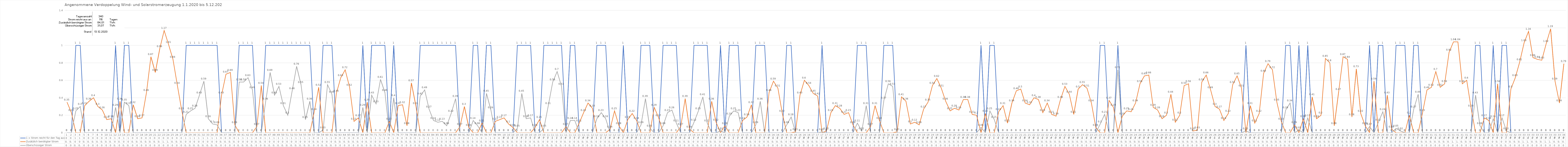
| Category | 1 = Strom reicht für den Tag aus | Zusätzlich benötigter Strom | Überschüssiger Strom |
|---|---|---|---|
| 0 | 0 | 0.35 | 0 |
| 1 | 0 | 0.23 | 0 |
| 2 | 1 | 0 | 0.25 |
| 3 | 1 | 0 | 0.3 |
| 4 | 0 | 0.31 | 0 |
| 5 | 0 | 0.36 | 0 |
| 6 | 0 | 0.4 | 0 |
| 7 | 0 | 0.3 | 0 |
| 8 | 0 | 0.26 | 0 |
| 9 | 0 | 0.15 | 0 |
| 10 | 0 | 0.16 | 0 |
| 11 | 1 | 0 | 0.29 |
| 12 | 0 | 0.36 | 0 |
| 13 | 1 | 0 | 0.35 |
| 14 | 1 | 0 | 0.31 |
| 15 | 0 | 0.32 | 0 |
| 16 | 0 | 0.16 | 0 |
| 17 | 0 | 0.17 | 0 |
| 18 | 0 | 0.46 | 0 |
| 19 | 0 | 0.87 | 0 |
| 20 | 0 | 0.69 | 0 |
| 21 | 0 | 0.96 | 0 |
| 22 | 0 | 1.17 | 0 |
| 23 | 0 | 1.01 | 0 |
| 24 | 0 | 0.84 | 0 |
| 25 | 0 | 0.54 | 0 |
| 26 | 0 | 0.25 | 0 |
| 27 | 1 | 0 | 0.21 |
| 28 | 1 | 0 | 0.25 |
| 29 | 1 | 0 | 0.28 |
| 30 | 1 | 0 | 0.43 |
| 31 | 1 | 0 | 0.59 |
| 32 | 1 | 0 | 0.16 |
| 33 | 1 | 0 | 0.1 |
| 34 | 1 | 0 | 0.09 |
| 35 | 0 | 0.43 | 0 |
| 36 | 0 | 0.67 | 0 |
| 37 | 0 | 0.69 | 0 |
| 38 | 0 | 0.09 | 0 |
| 39 | 1 | 0 | 0.58 |
| 40 | 1 | 0 | 0.58 |
| 41 | 1 | 0 | 0.63 |
| 42 | 1 | 0 | 0.49 |
| 43 | 0 | 0.07 | 0 |
| 44 | 0 | 0.54 | 0 |
| 45 | 1 | 0 | 0.36 |
| 46 | 1 | 0 | 0.69 |
| 47 | 1 | 0 | 0.43 |
| 48 | 1 | 0 | 0.53 |
| 49 | 1 | 0 | 0.31 |
| 50 | 1 | 0 | 0.2 |
| 51 | 1 | 0 | 0.48 |
| 52 | 1 | 0 | 0.76 |
| 53 | 1 | 0 | 0.55 |
| 54 | 1 | 0 | 0.15 |
| 55 | 1 | 0 | 0.36 |
| 56 | 0 | 0.24 | 0 |
| 57 | 0 | 0.52 | 0 |
| 58 | 1 | 0 | 0.03 |
| 59 | 1 | 0 | 0.55 |
| 60 | 1 | 0 | 0.44 |
| 61 | 0 | 0.45 | 0 |
| 62 | 0 | 0.63 | 0 |
| 63 | 0 | 0.72 | 0 |
| 64 | 0 | 0.52 | 0 |
| 65 | 0 | 0.13 | 0 |
| 66 | 0 | 0.17 | 0 |
| 67 | 1 | 0 | 0.29 |
| 68 | 0 | 0.35 | 0 |
| 69 | 1 | 0 | 0.43 |
| 70 | 1 | 0 | 0.33 |
| 71 | 1 | 0 | 0.61 |
| 72 | 1 | 0 | 0.46 |
| 73 | 0 | 0.13 | 0 |
| 74 | 1 | 0 | 0.4 |
| 75 | 0 | 0.31 | 0 |
| 76 | 0 | 0.32 | 0 |
| 77 | 0 | 0.08 | 0 |
| 78 | 0 | 0.57 | 0 |
| 79 | 0 | 0.31 | 0 |
| 80 | 1 | 0 | 0.42 |
| 81 | 1 | 0 | 0.49 |
| 82 | 1 | 0 | 0.27 |
| 83 | 1 | 0 | 0.14 |
| 84 | 1 | 0 | 0.12 |
| 85 | 1 | 0 | 0.13 |
| 86 | 1 | 0 | 0.08 |
| 87 | 1 | 0 | 0.22 |
| 88 | 1 | 0 | 0.39 |
| 89 | 0 | 0.07 | 0 |
| 90 | 0 | 0.3 | 0 |
| 91 | 0 | 0.06 | 0 |
| 92 | 1 | 0 | 0.14 |
| 93 | 1 | 0 | 0.08 |
| 94 | 0 | 0.11 | 0 |
| 95 | 1 | 0 | 0.45 |
| 96 | 1 | 0 | 0.26 |
| 97 | 0 | 0.13 | 0 |
| 98 | 0 | 0.15 | 0 |
| 99 | 0 | 0.17 | 0 |
| 100 | 0 | 0.1 | 0 |
| 101 | 0 | 0.06 | 0 |
| 102 | 1 | 0 | 0.05 |
| 103 | 1 | 0 | 0.45 |
| 104 | 1 | 0 | 0.16 |
| 105 | 1 | 0 | 0.17 |
| 106 | 0 | 0.06 | 0 |
| 107 | 0 | 0.15 | 0 |
| 108 | 1 | 0 | 0.05 |
| 109 | 1 | 0 | 0.31 |
| 110 | 1 | 0 | 0.58 |
| 111 | 1 | 0 | 0.7 |
| 112 | 1 | 0 | 0.53 |
| 113 | 0 | 0.07 | 0 |
| 114 | 1 | 0 | 0.14 |
| 115 | 1 | 0 | 0.14 |
| 116 | 0 | 0.11 | 0 |
| 117 | 0 | 0.23 | 0 |
| 118 | 0 | 0.34 | 0 |
| 119 | 0 | 0.28 | 0 |
| 120 | 1 | 0 | 0.16 |
| 121 | 1 | 0 | 0.23 |
| 122 | 1 | 0 | 0.16 |
| 123 | 0 | 0.04 | 0 |
| 124 | 0 | 0.25 | 0 |
| 125 | 0 | 0.08 | 0 |
| 126 | 1 | 0 | 0 |
| 127 | 0 | 0.15 | 0 |
| 128 | 0 | 0.22 | 0 |
| 129 | 0 | 0.14 | 0 |
| 130 | 1 | 0 | 0.09 |
| 131 | 1 | 0 | 0.39 |
| 132 | 1 | 0 | 0.05 |
| 133 | 0 | 0.29 | 0 |
| 134 | 0 | 0.17 | 0 |
| 135 | 1 | 0 | 0.08 |
| 136 | 1 | 0 | 0.23 |
| 137 | 1 | 0 | 0.26 |
| 138 | 1 | 0 | 0.11 |
| 139 | 0 | 0.07 | 0 |
| 140 | 0 | 0.39 | 0 |
| 141 | 0 | 0.04 | 0 |
| 142 | 1 | 0 | 0.12 |
| 143 | 1 | 0 | 0.25 |
| 144 | 1 | 0 | 0.41 |
| 145 | 1 | 0 | 0.11 |
| 146 | 0 | 0.36 | 0 |
| 147 | 0 | 0.12 | 0 |
| 148 | 1 | 0 | 0.02 |
| 149 | 0 | 0.08 | 0 |
| 150 | 1 | 0 | 0.19 |
| 151 | 1 | 0 | 0.25 |
| 152 | 1 | 0 | 0.23 |
| 153 | 0 | 0.14 | 0 |
| 154 | 0 | 0.18 | 0 |
| 155 | 0 | 0.32 | 0 |
| 156 | 1 | 0 | 0.09 |
| 157 | 1 | 0 | 0.36 |
| 158 | 1 | 0 | 0 |
| 159 | 0 | 0.46 | 0 |
| 160 | 0 | 0.59 | 0 |
| 161 | 0 | 0.51 | 0 |
| 162 | 0 | 0.22 | 0 |
| 163 | 1 | 0 | 0.09 |
| 164 | 1 | 0 | 0.18 |
| 165 | 0 | 0.01 | 0 |
| 166 | 0 | 0.43 | 0 |
| 167 | 0 | 0.6 | 0 |
| 168 | 0 | 0.54 | 0 |
| 169 | 0 | 0.45 | 0 |
| 170 | 0 | 0.42 | 0 |
| 171 | 1 | 0 | 0.01 |
| 172 | 0 | 0.02 | 0 |
| 173 | 0 | 0.23 | 0 |
| 174 | 0 | 0.31 | 0 |
| 175 | 0 | 0.28 | 0 |
| 176 | 0 | 0.21 | 0 |
| 177 | 0 | 0.23 | 0 |
| 178 | 0 | 0.09 | 0 |
| 179 | 1 | 0 | 0.11 |
| 180 | 1 | 0 | 0.02 |
| 181 | 1 | 0 | 0.31 |
| 182 | 0 | 0.07 | 0 |
| 183 | 0 | 0.31 | 0 |
| 184 | 0 | 0.14 | 0 |
| 185 | 1 | 0 | 0.37 |
| 186 | 1 | 0 | 0.56 |
| 187 | 1 | 0 | 0.53 |
| 188 | 0 | 0.01 | 0 |
| 189 | 0 | 0.41 | 0 |
| 190 | 0 | 0.36 | 0 |
| 191 | 0 | 0.1 | 0 |
| 192 | 0 | 0.12 | 0 |
| 193 | 0 | 0.09 | 0 |
| 194 | 0 | 0.27 | 0 |
| 195 | 0 | 0.35 | 0 |
| 196 | 0 | 0.54 | 0 |
| 197 | 0 | 0.62 | 0 |
| 198 | 0 | 0.51 | 0 |
| 199 | 0 | 0.36 | 0 |
| 200 | 0 | 0.25 | 0 |
| 201 | 0 | 0.28 | 0 |
| 202 | 0 | 0.26 | 0 |
| 203 | 0 | 0.38 | 0 |
| 204 | 0 | 0.38 | 0 |
| 205 | 0 | 0.21 | 0 |
| 206 | 0 | 0.2 | 0 |
| 207 | 1 | 0 | 0.06 |
| 208 | 0 | 0.22 | 0 |
| 209 | 1 | 0 | 0.25 |
| 210 | 1 | 0 | 0.15 |
| 211 | 0 | 0.24 | 0 |
| 212 | 0 | 0.31 | 0 |
| 213 | 0 | 0.11 | 0 |
| 214 | 0 | 0.34 | 0 |
| 215 | 0 | 0.48 | 0 |
| 216 | 0 | 0.5 | 0 |
| 217 | 0 | 0.34 | 0 |
| 218 | 0 | 0.32 | 0 |
| 219 | 0 | 0.4 | 0 |
| 220 | 0 | 0.38 | 0 |
| 221 | 0 | 0.23 | 0 |
| 222 | 0 | 0.34 | 0 |
| 223 | 0 | 0.21 | 0 |
| 224 | 0 | 0.19 | 0 |
| 225 | 0 | 0.38 | 0 |
| 226 | 0 | 0.53 | 0 |
| 227 | 0 | 0.44 | 0 |
| 228 | 0 | 0.21 | 0 |
| 229 | 0 | 0.5 | 0 |
| 230 | 0 | 0.55 | 0 |
| 231 | 0 | 0.51 | 0 |
| 232 | 0 | 0.34 | 0 |
| 233 | 0 | 0.06 | 0 |
| 234 | 1 | 0 | 0.1 |
| 235 | 1 | 0 | 0.21 |
| 236 | 0 | 0.37 | 0 |
| 237 | 0 | 0.29 | 0 |
| 238 | 1 | 0 | 0.72 |
| 239 | 0 | 0.19 | 0 |
| 240 | 0 | 0.25 | 0 |
| 241 | 0 | 0.24 | 0 |
| 242 | 0 | 0.34 | 0 |
| 243 | 0 | 0.56 | 0 |
| 244 | 0 | 0.65 | 0 |
| 245 | 0 | 0.66 | 0 |
| 246 | 0 | 0.29 | 0 |
| 247 | 0 | 0.26 | 0 |
| 248 | 0 | 0.16 | 0 |
| 249 | 0 | 0.2 | 0 |
| 250 | 0 | 0.44 | 0 |
| 251 | 0 | 0.12 | 0 |
| 252 | 0 | 0.2 | 0 |
| 253 | 0 | 0.54 | 0 |
| 254 | 0 | 0.56 | 0 |
| 255 | 0 | 0.02 | 0 |
| 256 | 0 | 0.03 | 0 |
| 257 | 0 | 0.58 | 0 |
| 258 | 0 | 0.66 | 0 |
| 259 | 0 | 0.49 | 0 |
| 260 | 0 | 0.3 | 0 |
| 261 | 0 | 0.27 | 0 |
| 262 | 0 | 0.14 | 0 |
| 263 | 0 | 0.22 | 0 |
| 264 | 0 | 0.55 | 0 |
| 265 | 0 | 0.65 | 0 |
| 266 | 0 | 0.51 | 0 |
| 267 | 1 | 0 | 0.02 |
| 268 | 0 | 0.31 | 0 |
| 269 | 0 | 0.11 | 0 |
| 270 | 0 | 0.22 | 0 |
| 271 | 0 | 0.68 | 0 |
| 272 | 0 | 0.79 | 0 |
| 273 | 0 | 0.72 | 0 |
| 274 | 0 | 0.35 | 0 |
| 275 | 0 | 0.13 | 0 |
| 276 | 1 | 0 | 0.26 |
| 277 | 1 | 0 | 0.34 |
| 278 | 0 | 0.09 | 0 |
| 279 | 1 | 0 | 0.03 |
| 280 | 0 | 0.16 | 0 |
| 281 | 1 | 0 | 0.17 |
| 282 | 0 | 0.41 | 0 |
| 283 | 0 | 0.16 | 0 |
| 284 | 0 | 0.2 | 0 |
| 285 | 0 | 0.85 | 0 |
| 286 | 0 | 0.8 | 0 |
| 287 | 0 | 0.08 | 0 |
| 288 | 0 | 0.47 | 0 |
| 289 | 0 | 0.87 | 0 |
| 290 | 0 | 0.84 | 0 |
| 291 | 0 | 0.18 | 0 |
| 292 | 0 | 0.73 | 0 |
| 293 | 0 | 0.22 | 0 |
| 294 | 0 | 0.08 | 0 |
| 295 | 1 | 0 | 0.07 |
| 296 | 0 | 0.59 | 0 |
| 297 | 1 | 0 | 0.12 |
| 298 | 1 | 0 | 0.24 |
| 299 | 0 | 0.43 | 0 |
| 300 | 0 | 0.04 | 0 |
| 301 | 1 | 0 | 0.05 |
| 302 | 1 | 0 | 0.02 |
| 303 | 1 | 0 | 0 |
| 304 | 0 | 0.2 | 0 |
| 305 | 1 | 0 | 0.27 |
| 306 | 1 | 0 | 0.44 |
| 307 | 0 | 0.23 | 0 |
| 308 | 0 | 0.49 | 0 |
| 309 | 0 | 0.52 | 0 |
| 310 | 0 | 0.7 | 0 |
| 311 | 0 | 0.52 | 0 |
| 312 | 0 | 0.56 | 0 |
| 313 | 0 | 0.92 | 0 |
| 314 | 0 | 1.04 | 0 |
| 315 | 0 | 1.04 | 0 |
| 316 | 0 | 0.56 | 0 |
| 317 | 0 | 0.6 | 0 |
| 318 | 0 | 0.28 | 0 |
| 319 | 1 | 0 | 0.43 |
| 320 | 1 | 0 | 0.08 |
| 321 | 0 | 0.17 | 0 |
| 322 | 0 | 0.14 | 0 |
| 323 | 1 | 0 | 0.16 |
| 324 | 0 | 0.56 | 0 |
| 325 | 1 | 0 | 0.17 |
| 326 | 1 | 0 | 0.02 |
| 327 | 0 | 0.5 | 0 |
| 328 | 0 | 0.63 | 0 |
| 329 | 0 | 0.81 | 0 |
| 330 | 0 | 1.03 | 0 |
| 331 | 0 | 1.16 | 0 |
| 332 | 0 | 0.86 | 0 |
| 333 | 0 | 0.84 | 0 |
| 334 | 0 | 0.83 | 0 |
| 335 | 0 | 1.02 | 0 |
| 336 | 0 | 1.19 | 0 |
| 337 | 0 | 0.59 | 0 |
| 338 | 0 | 0.34 | 0 |
| 339 | 0 | 0.79 | 0 |